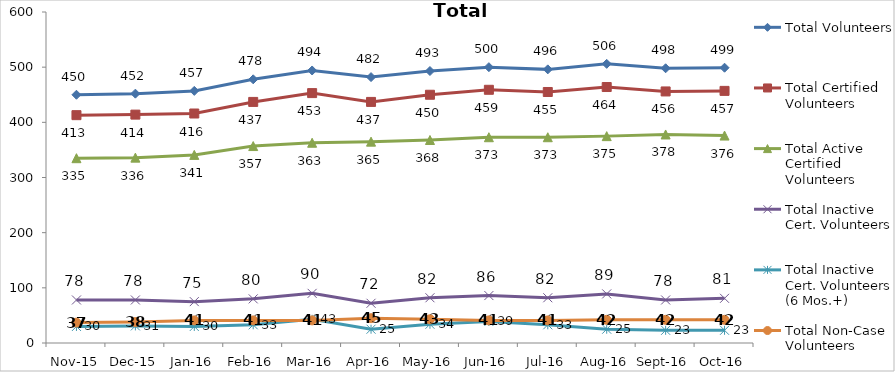
| Category | Total Volunteers | Total Certified Volunteers | Total Active Certified Volunteers | Total Inactive Cert. Volunteers | Total Inactive Cert. Volunteers (6 Mos.+) | Total Non-Case Volunteers |
|---|---|---|---|---|---|---|
| Nov-15 | 450 | 413 | 335 | 78 | 30 | 37 |
| Dec-15 | 452 | 414 | 336 | 78 | 31 | 38 |
| Jan-16 | 457 | 416 | 341 | 75 | 30 | 41 |
| Feb-16 | 478 | 437 | 357 | 80 | 33 | 41 |
| Mar-16 | 494 | 453 | 363 | 90 | 43 | 41 |
| Apr-16 | 482 | 437 | 365 | 72 | 25 | 45 |
| May-16 | 493 | 450 | 368 | 82 | 34 | 43 |
| Jun-16 | 500 | 459 | 373 | 86 | 39 | 41 |
| Jul-16 | 496 | 455 | 373 | 82 | 33 | 41 |
| Aug-16 | 506 | 464 | 375 | 89 | 25 | 42 |
| Sep-16 | 498 | 456 | 378 | 78 | 23 | 42 |
| Oct-16 | 499 | 457 | 376 | 81 | 23 | 42 |